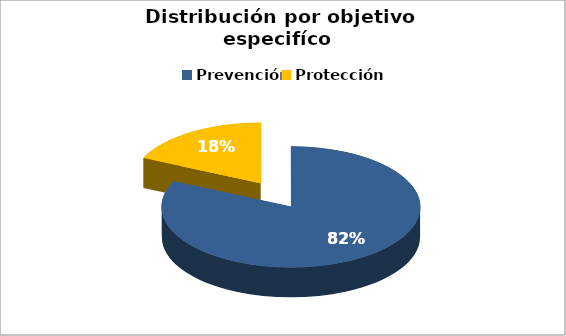
| Category | Series 0 |
|---|---|
| Prevención | 86 |
| Protección  | 19 |